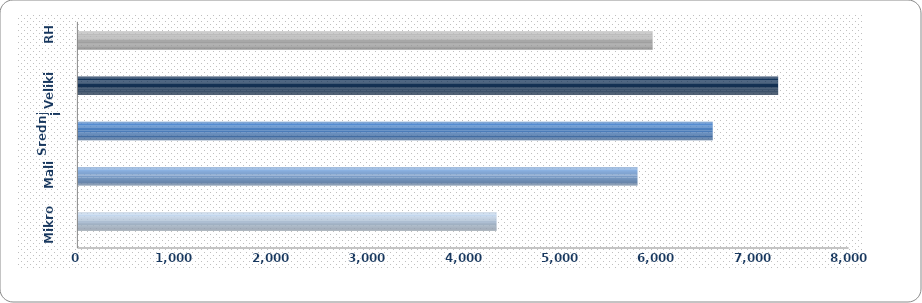
| Category | Mikro Mali Srednji Veliki |
|---|---|
| Mikro | 4352.197 |
| Mali | 5814.209 |
| Srednji | 6594.309 |
| Veliki | 7273.125 |
| RH | 5970.837 |